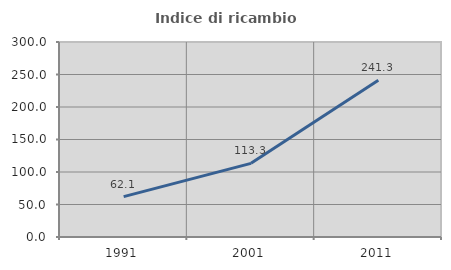
| Category | Indice di ricambio occupazionale  |
|---|---|
| 1991.0 | 62.082 |
| 2001.0 | 113.298 |
| 2011.0 | 241.322 |